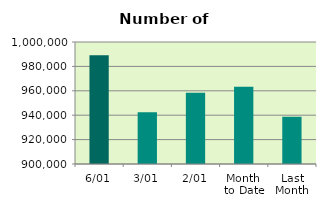
| Category | Series 0 |
|---|---|
| 6/01 | 989174 |
| 3/01 | 942368 |
| 2/01 | 958394 |
| Month 
to Date | 963312 |
| Last
Month | 938735.9 |